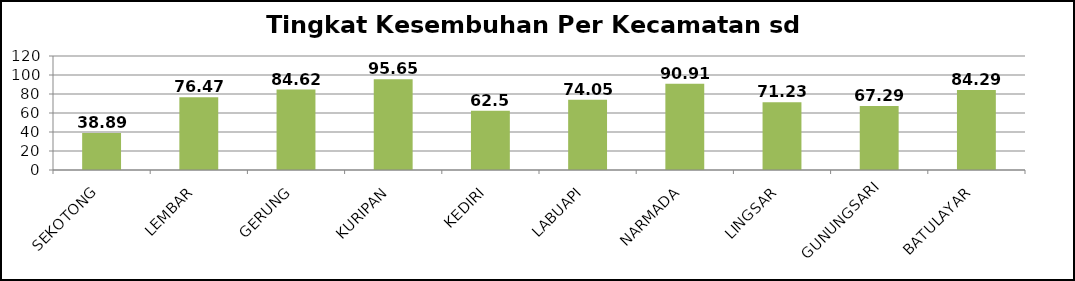
| Category | Series 0 |
|---|---|
| SEKOTONG | 38.89 |
| LEMBAR | 76.47 |
| GERUNG | 84.62 |
| KURIPAN | 95.65 |
| KEDIRI | 62.5 |
| LABUAPI | 74.05 |
| NARMADA | 90.91 |
| LINGSAR | 71.23 |
| GUNUNGSARI | 67.29 |
| BATULAYAR | 84.29 |